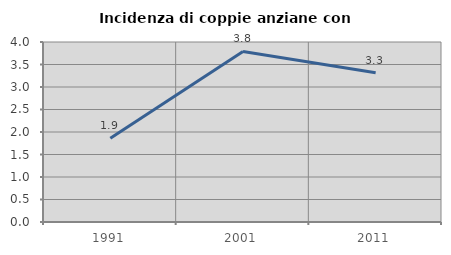
| Category | Incidenza di coppie anziane con figli |
|---|---|
| 1991.0 | 1.859 |
| 2001.0 | 3.79 |
| 2011.0 | 3.315 |